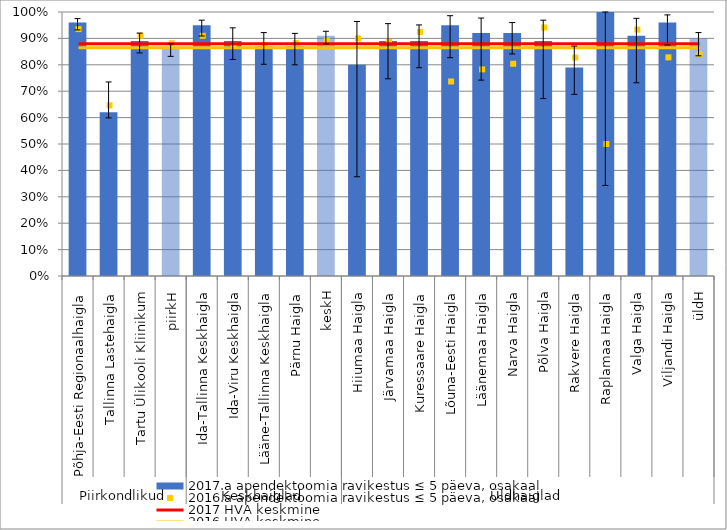
| Category | 2017.a apendektoomia ravikestus ≤ 5 päeva, osakaal |
|---|---|
| 0 | 0.96 |
| 1 | 0.62 |
| 2 | 0.89 |
| 3 | 0.86 |
| 4 | 0.95 |
| 5 | 0.89 |
| 6 | 0.87 |
| 7 | 0.87 |
| 8 | 0.91 |
| 9 | 0.8 |
| 10 | 0.89 |
| 11 | 0.89 |
| 12 | 0.95 |
| 13 | 0.92 |
| 14 | 0.92 |
| 15 | 0.89 |
| 16 | 0.79 |
| 17 | 1 |
| 18 | 0.91 |
| 19 | 0.96 |
| 20 | 0.9 |